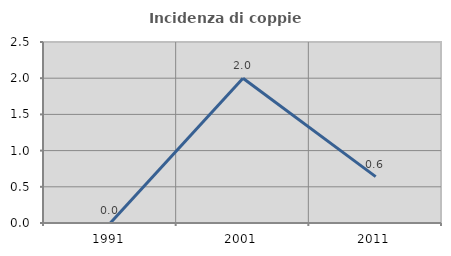
| Category | Incidenza di coppie miste |
|---|---|
| 1991.0 | 0 |
| 2001.0 | 2 |
| 2011.0 | 0.641 |